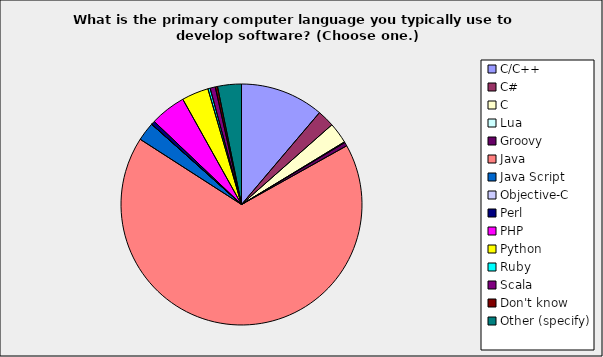
| Category | Series 0 |
|---|---|
| C/C++ | 0.112 |
| C# | 0.023 |
| C | 0.028 |
| Lua | 0.001 |
| Groovy | 0.005 |
| Java | 0.672 |
| Java Script | 0.025 |
| Objective-C | 0 |
| Perl | 0.005 |
| PHP | 0.048 |
| Python | 0.036 |
| Ruby | 0.003 |
| Scala | 0.007 |
| Don't know | 0.003 |
| Other (specify) | 0.032 |